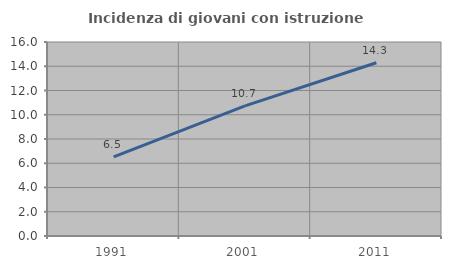
| Category | Incidenza di giovani con istruzione universitaria |
|---|---|
| 1991.0 | 6.522 |
| 2001.0 | 10.728 |
| 2011.0 | 14.286 |